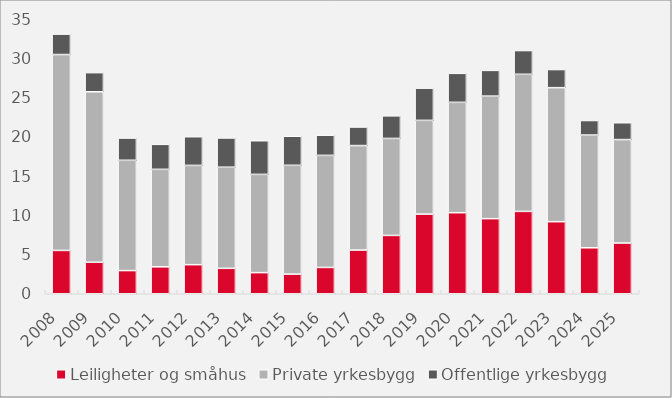
| Category | Leiligheter og småhus | Private yrkesbygg | Offentlige yrkesbygg |
|---|---|---|---|
| 2008.0 | 5.514 | 24.932 | 2.603 |
| 2009.0 | 4.011 | 21.695 | 2.436 |
| 2010.0 | 2.951 | 14.037 | 2.829 |
| 2011.0 | 3.428 | 12.407 | 3.181 |
| 2012.0 | 3.701 | 12.634 | 3.651 |
| 2013.0 | 3.235 | 12.872 | 3.721 |
| 2014.0 | 2.691 | 12.503 | 4.282 |
| 2015.0 | 2.501 | 13.848 | 3.696 |
| 2016.0 | 3.348 | 14.261 | 2.571 |
| 2017.0 | 5.564 | 13.294 | 2.363 |
| 2018.0 | 7.425 | 12.342 | 2.878 |
| 2019.0 | 10.136 | 11.931 | 4.101 |
| 2020.0 | 10.315 | 14.047 | 3.69 |
| 2021.0 | 9.559 | 15.596 | 3.274 |
| 2022.0 | 10.484 | 17.448 | 3.02 |
| 2023.0 | 9.175 | 17.055 | 2.307 |
| 2024.0 | 5.852 | 14.348 | 1.849 |
| 2025.0 | 6.461 | 13.163 | 2.143 |